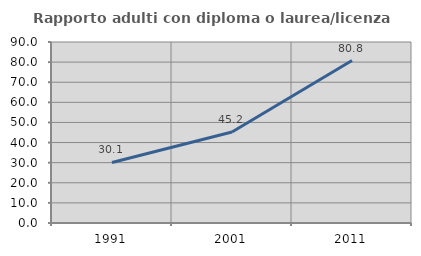
| Category | Rapporto adulti con diploma o laurea/licenza media  |
|---|---|
| 1991.0 | 30.102 |
| 2001.0 | 45.238 |
| 2011.0 | 80.769 |